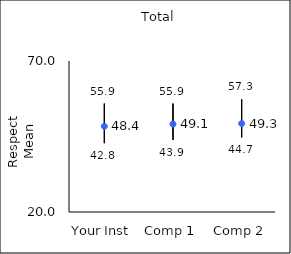
| Category | 25th percentile | 75th percentile | Mean |
|---|---|---|---|
| Your Inst | 42.8 | 55.9 | 48.37 |
| Comp 1 | 43.9 | 55.9 | 49.09 |
| Comp 2 | 44.7 | 57.3 | 49.3 |